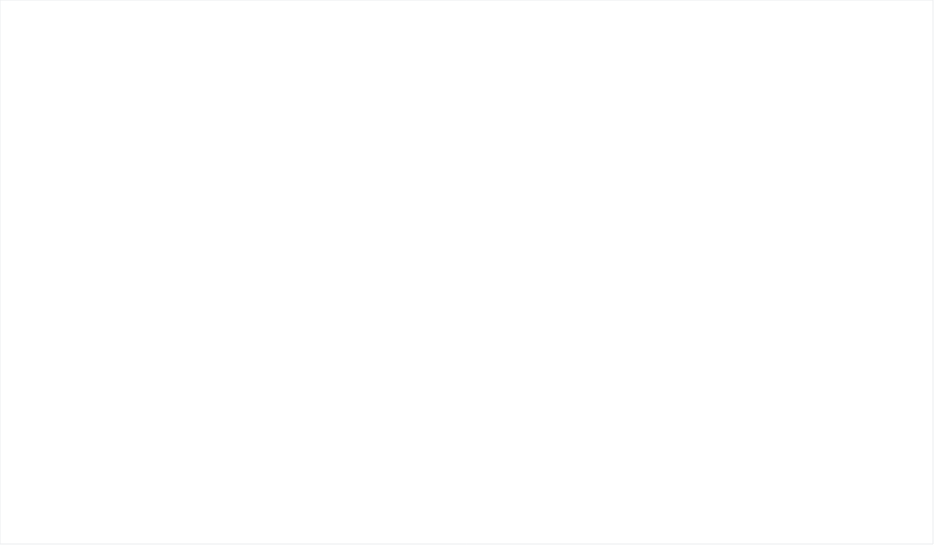
| Category | Biomass | Fossil Brown coal/Lignite | Fossil Coal-derived gas | Fossil Gas | Fossil Hard coal | Fossil Oil | Fossil Oil shale | Fossil Peat | GenCap | Geothermal | Hydro Pumped Storage | Hydro Run-of-river and poundage | Hydro Water Reservoir | Marine | Nuclear | Other | Other renewable | Solar | Waste | Wind Offshore | Wind Onshore |
|---|---|---|---|---|---|---|---|---|---|---|---|---|---|---|---|---|---|---|---|---|---|
| 2015 | 77 | 0 | 86 | 181 | 0 | 0 | 1698 | 0 |  | 0 | 0 | 8 | 0 | 0 | 0 | 0 | 7 | 1 | 20 | 0 | 307 |
| 2016 | 77 | 0 | 86 | 119 | 0 | 0 | 1975 | 0 |  | 0 | 0 | 8 | 0 | 0 | 0 | 0 | 7 | 1 | 20 | 0 | 375 |
| 2017 | 86 | 0 | 85 | 129 | 0 | 0 | 1976 | 0 |  | 0 | 0 | 8 | 0 | 0 | 0 | 0 | 6 | 1 | 20 | 0 | 384 |
| 2018 | 102 | 0 | 85 | 119 | 0 | 0 | 1976 | 0 |  | 0 | 0 | 8 | 0 | 0 | 0 | 0 | 5 | 1 | 19 | 0 | 487 |
| 2019 | 157 | 0 | 51 | 125 | 0 | 8 | 1970 | 0 |  | 0 | 0 | 7 | 0 | 0 | 0 | 0 | 12 | 33 | 19 | 0 | 462 |
| 2020 | 157 | 0 | 79 | 133 | 0 | 8 | 1970 | 0 |  | 0 | 0 | 8 | 0 | 0 | 0 | 0 | 12 | 123 | 19 | 0 | 329 |